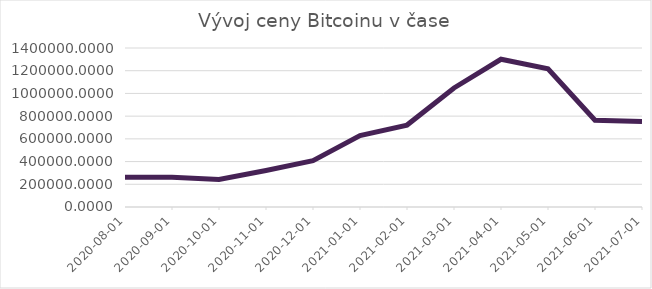
| Category | hodnota (CZK) |
|---|---|
| 2020-08-01 | 262230.075 |
| 2020-09-01 | 262762.721 |
| 2020-10-01 | 243010.406 |
| 2020-11-01 | 321700.249 |
| 2020-12-01 | 408501.466 |
| 2021-01-01 | 629599.806 |
| 2021-02-01 | 721433.467 |
| 2021-03-01 | 1048110.274 |
| 2021-04-01 | 1300873.809 |
| 2021-05-01 | 1217685.516 |
| 2021-06-01 | 763512.719 |
| 2021-07-01 | 753440.891 |